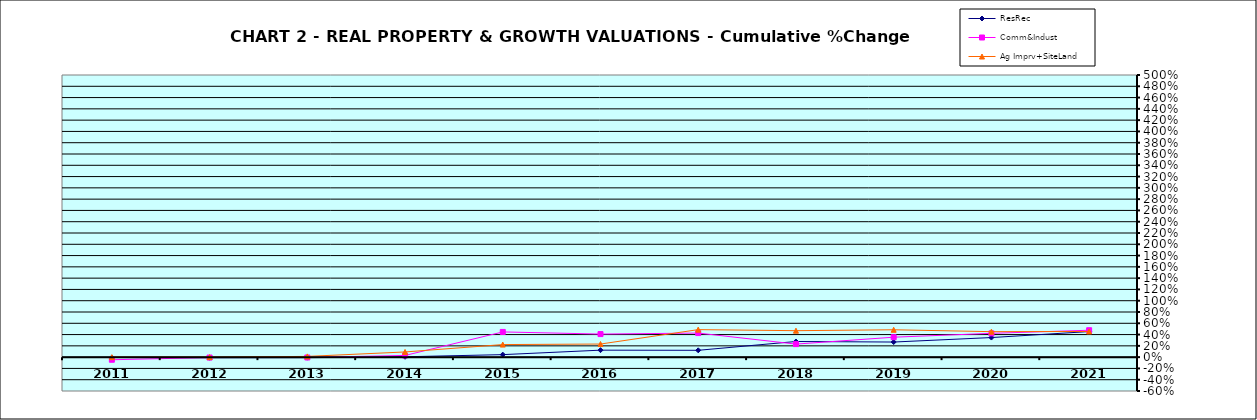
| Category | ResRec | Comm&Indust | Ag Imprv+SiteLand |
|---|---|---|---|
| 2011.0 | -0.007 | -0.046 | 0 |
| 2012.0 | -0.011 | -0.007 | 0 |
| 2013.0 | -0.009 | -0.006 | 0.013 |
| 2014.0 | 0.007 | 0.03 | 0.092 |
| 2015.0 | 0.045 | 0.447 | 0.223 |
| 2016.0 | 0.124 | 0.409 | 0.232 |
| 2017.0 | 0.121 | 0.427 | 0.488 |
| 2018.0 | 0.277 | 0.231 | 0.469 |
| 2019.0 | 0.268 | 0.353 | 0.485 |
| 2020.0 | 0.347 | 0.422 | 0.451 |
| 2021.0 | 0.453 | 0.477 | 0.455 |